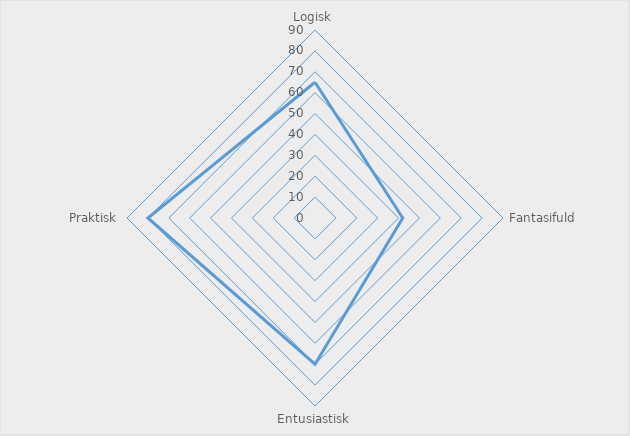
| Category | Series 0 |
|---|---|
| Logisk | 65 |
| Fantasifuld | 42 |
| Entusiastisk | 70 |
| Praktisk | 80 |